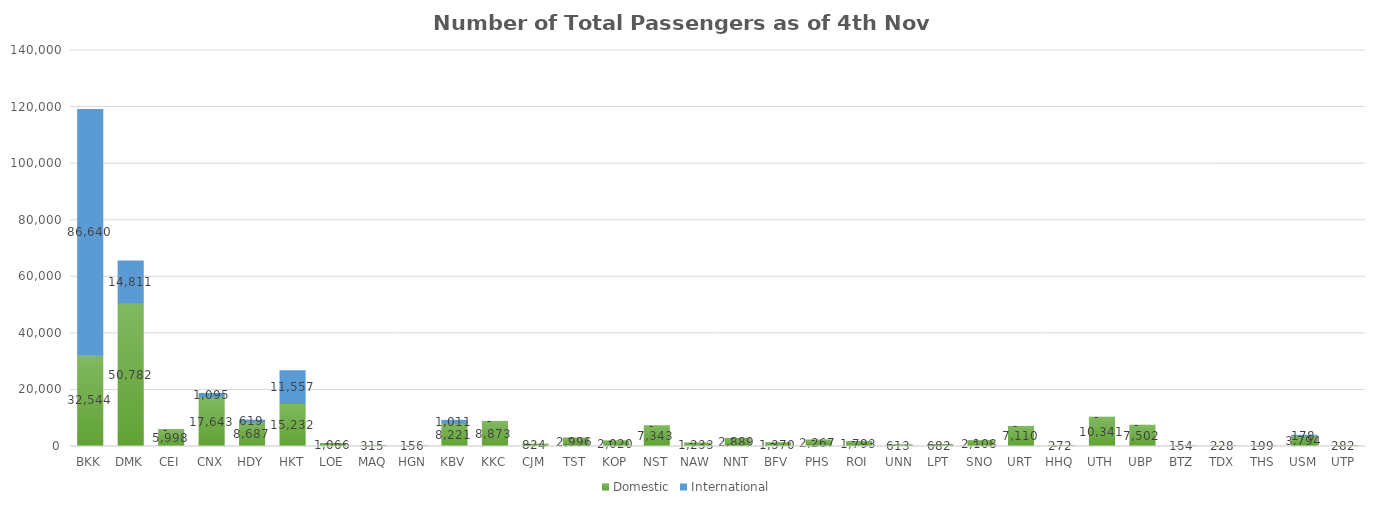
| Category | Domestic | International |
|---|---|---|
| BKK | 32544 | 86640 |
| DMK | 50782 | 14811 |
| CEI | 5998 | 0 |
| CNX | 17643 | 1095 |
| HDY | 8687 | 619 |
| HKT | 15232 | 11557 |
| LOE | 1066 | 0 |
| MAQ | 315 | 0 |
| HGN | 156 | 0 |
| KBV | 8221 | 1011 |
| KKC | 8873 | 0 |
| CJM | 824 | 0 |
| TST | 2996 | 0 |
| KOP | 2020 | 0 |
| NST | 7343 | 0 |
| NAW | 1233 | 0 |
| NNT | 2889 | 0 |
| BFV | 1370 | 0 |
| PHS | 2267 | 0 |
| ROI | 1793 | 0 |
| UNN | 613 | 0 |
| LPT | 682 | 0 |
| SNO | 2108 | 0 |
| URT | 7110 | 0 |
| HHQ | 272 | 0 |
| UTH | 10341 | 0 |
| UBP | 7502 | 0 |
| BTZ | 154 | 0 |
| TDX | 228 | 0 |
| THS | 199 | 0 |
| USM | 3794 | 178 |
| UTP | 282 | 0 |